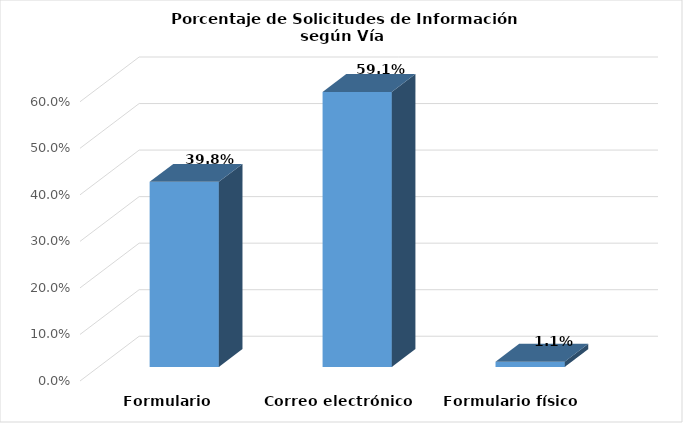
| Category | Series 0 |
|---|---|
| Formulario electrónico SAIP | 0.398 |
| Correo electrónico | 0.591 |
| Formulario físico | 0.011 |